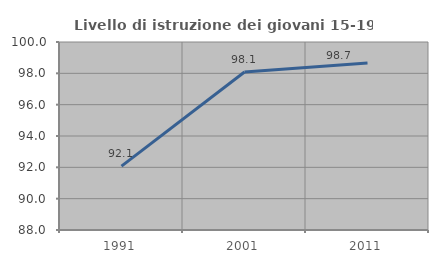
| Category | Livello di istruzione dei giovani 15-19 anni |
|---|---|
| 1991.0 | 92.079 |
| 2001.0 | 98.087 |
| 2011.0 | 98.661 |